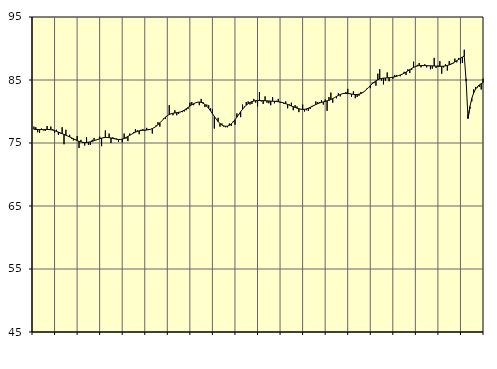
| Category | Samtliga sysselsatta (inkl. sysselsatta utomlands) | Series 1 |
|---|---|---|
| nan | 77.6 | 77.18 |
| 1.0 | 77.5 | 77.15 |
| 1.0 | 76.7 | 77.15 |
| 1.0 | 76.6 | 77.14 |
| 1.0 | 77.3 | 77.13 |
| 1.0 | 77 | 77.13 |
| 1.0 | 76.9 | 77.15 |
| 1.0 | 77.7 | 77.15 |
| 1.0 | 77.2 | 77.14 |
| 1.0 | 77.6 | 77.11 |
| 1.0 | 77.2 | 77.05 |
| 1.0 | 76.6 | 76.97 |
| nan | 77.1 | 76.86 |
| 2.0 | 76.3 | 76.73 |
| 2.0 | 76.5 | 76.61 |
| 2.0 | 77.5 | 76.48 |
| 2.0 | 74.8 | 76.36 |
| 2.0 | 77.1 | 76.23 |
| 2.0 | 76.1 | 76.1 |
| 2.0 | 76.3 | 75.97 |
| 2.0 | 75.7 | 75.82 |
| 2.0 | 75.4 | 75.67 |
| 2.0 | 75.6 | 75.52 |
| 2.0 | 76.1 | 75.38 |
| nan | 74.2 | 75.26 |
| 3.0 | 75.5 | 75.16 |
| 3.0 | 75 | 75.11 |
| 3.0 | 74.6 | 75.08 |
| 3.0 | 75.9 | 75.09 |
| 3.0 | 74.7 | 75.12 |
| 3.0 | 74.7 | 75.18 |
| 3.0 | 75.5 | 75.26 |
| 3.0 | 75.8 | 75.36 |
| 3.0 | 75.5 | 75.47 |
| 3.0 | 75.5 | 75.58 |
| 3.0 | 76 | 75.68 |
| nan | 74.5 | 75.77 |
| 4.0 | 75.9 | 75.84 |
| 4.0 | 77 | 75.88 |
| 4.0 | 75.8 | 75.88 |
| 4.0 | 76.5 | 75.85 |
| 4.0 | 75 | 75.8 |
| 4.0 | 75.9 | 75.73 |
| 4.0 | 75.8 | 75.66 |
| 4.0 | 75.7 | 75.6 |
| 4.0 | 75.2 | 75.56 |
| 4.0 | 75.5 | 75.56 |
| 4.0 | 75.1 | 75.62 |
| nan | 76.5 | 75.72 |
| 5.0 | 75.7 | 75.87 |
| 5.0 | 75.3 | 76.04 |
| 5.0 | 76.5 | 76.22 |
| 5.0 | 76.4 | 76.4 |
| 5.0 | 76.7 | 76.57 |
| 5.0 | 77.2 | 76.72 |
| 5.0 | 77 | 76.84 |
| 5.0 | 76.4 | 76.93 |
| 5.0 | 77.1 | 76.98 |
| 5.0 | 77.2 | 77.02 |
| 5.0 | 76.9 | 77.04 |
| nan | 77.4 | 77.07 |
| 6.0 | 77.2 | 77.11 |
| 6.0 | 77.2 | 77.18 |
| 6.0 | 76.5 | 77.29 |
| 6.0 | 77.5 | 77.44 |
| 6.0 | 77.8 | 77.65 |
| 6.0 | 78.3 | 77.91 |
| 6.0 | 77.6 | 78.2 |
| 6.0 | 78.5 | 78.5 |
| 6.0 | 78.9 | 78.81 |
| 6.0 | 78.8 | 79.1 |
| 6.0 | 79.3 | 79.34 |
| nan | 81 | 79.52 |
| 7.0 | 79.6 | 79.64 |
| 7.0 | 79.4 | 79.72 |
| 7.0 | 80.2 | 79.77 |
| 7.0 | 79.4 | 79.81 |
| 7.0 | 79.6 | 79.86 |
| 7.0 | 79.9 | 79.94 |
| 7.0 | 79.9 | 80.06 |
| 7.0 | 80 | 80.22 |
| 7.0 | 80.2 | 80.41 |
| 7.0 | 80.4 | 80.63 |
| 7.0 | 81.4 | 80.86 |
| nan | 81.5 | 81.06 |
| 8.0 | 81 | 81.24 |
| 8.0 | 81.4 | 81.38 |
| 8.0 | 81.5 | 81.47 |
| 8.0 | 81 | 81.5 |
| 8.0 | 82 | 81.45 |
| 8.0 | 81.5 | 81.32 |
| 8.0 | 80.7 | 81.11 |
| 8.0 | 81.1 | 80.83 |
| 8.0 | 81 | 80.49 |
| 8.0 | 80.5 | 80.09 |
| 8.0 | 80.4 | 79.66 |
| nan | 77.3 | 79.22 |
| 9.0 | 78.8 | 78.79 |
| 9.0 | 79 | 78.41 |
| 9.0 | 77.6 | 78.09 |
| 9.0 | 78.1 | 77.85 |
| 9.0 | 77.6 | 77.71 |
| 9.0 | 77.5 | 77.65 |
| 9.0 | 77.5 | 77.68 |
| 9.0 | 78.1 | 77.81 |
| 9.0 | 77.7 | 78.03 |
| 9.0 | 78.4 | 78.33 |
| 9.0 | 77.9 | 78.69 |
| nan | 79.7 | 79.1 |
| 10.0 | 79.6 | 79.53 |
| 10.0 | 79.1 | 79.96 |
| 10.0 | 81.1 | 80.35 |
| 10.0 | 80.8 | 80.71 |
| 10.0 | 81.5 | 81 |
| 10.0 | 81.6 | 81.24 |
| 10.0 | 81.1 | 81.43 |
| 10.0 | 81.2 | 81.57 |
| 10.0 | 82 | 81.66 |
| 10.0 | 81.4 | 81.72 |
| 10.0 | 80.8 | 81.74 |
| nan | 83.1 | 81.74 |
| 11.0 | 81.6 | 81.73 |
| 11.0 | 81.2 | 81.72 |
| 11.0 | 82.4 | 81.71 |
| 11.0 | 81.4 | 81.69 |
| 11.0 | 81.3 | 81.67 |
| 11.0 | 81 | 81.65 |
| 11.0 | 82.3 | 81.63 |
| 11.0 | 81.3 | 81.61 |
| 11.0 | 81.7 | 81.59 |
| 11.0 | 82 | 81.55 |
| 11.0 | 81.4 | 81.51 |
| nan | 81.5 | 81.44 |
| 12.0 | 81.2 | 81.35 |
| 12.0 | 81.6 | 81.24 |
| 12.0 | 80.5 | 81.12 |
| 12.0 | 81.1 | 81 |
| 12.0 | 81.4 | 80.87 |
| 12.0 | 80.2 | 80.76 |
| 12.0 | 81 | 80.64 |
| 12.0 | 80.8 | 80.53 |
| 12.0 | 79.9 | 80.44 |
| 12.0 | 80.4 | 80.37 |
| 12.0 | 81.1 | 80.33 |
| nan | 80 | 80.34 |
| 13.0 | 80.2 | 80.41 |
| 13.0 | 80.1 | 80.52 |
| 13.0 | 80.4 | 80.65 |
| 13.0 | 80.9 | 80.8 |
| 13.0 | 81 | 80.96 |
| 13.0 | 81.6 | 81.11 |
| 13.0 | 81.5 | 81.24 |
| 13.0 | 81.5 | 81.35 |
| 13.0 | 81.8 | 81.45 |
| 13.0 | 81.1 | 81.53 |
| 13.0 | 81.9 | 81.61 |
| nan | 80.1 | 81.69 |
| 14.0 | 82.3 | 81.78 |
| 14.0 | 83 | 81.9 |
| 14.0 | 81.4 | 82.05 |
| 14.0 | 82.2 | 82.21 |
| 14.0 | 82.1 | 82.39 |
| 14.0 | 82.9 | 82.56 |
| 14.0 | 82.4 | 82.7 |
| 14.0 | 82.8 | 82.81 |
| 14.0 | 82.9 | 82.87 |
| 14.0 | 83.1 | 82.88 |
| 14.0 | 83.6 | 82.87 |
| nan | 82.9 | 82.82 |
| 15.0 | 82.3 | 82.77 |
| 15.0 | 83.2 | 82.72 |
| 15.0 | 82.1 | 82.69 |
| 15.0 | 82.3 | 82.7 |
| 15.0 | 82.5 | 82.75 |
| 15.0 | 83.1 | 82.85 |
| 15.0 | 83.1 | 83.01 |
| 15.0 | 83.2 | 83.24 |
| 15.0 | 83.6 | 83.51 |
| 15.0 | 83.8 | 83.81 |
| 15.0 | 83.7 | 84.11 |
| nan | 84.6 | 84.4 |
| 16.0 | 84.5 | 84.65 |
| 16.0 | 84.1 | 84.87 |
| 16.0 | 86 | 85.04 |
| 16.0 | 86.7 | 85.16 |
| 16.0 | 84.9 | 85.25 |
| 16.0 | 84.3 | 85.3 |
| 16.0 | 84.9 | 85.32 |
| 16.0 | 86.2 | 85.34 |
| 16.0 | 84.8 | 85.36 |
| 16.0 | 85.4 | 85.39 |
| 16.0 | 85.2 | 85.44 |
| nan | 85.8 | 85.5 |
| 17.0 | 85.8 | 85.59 |
| 17.0 | 85.7 | 85.69 |
| 17.0 | 85.6 | 85.8 |
| 17.0 | 85.9 | 85.93 |
| 17.0 | 86.3 | 86.08 |
| 17.0 | 85.8 | 86.25 |
| 17.0 | 86.7 | 86.44 |
| 17.0 | 86.1 | 86.64 |
| 17.0 | 86.6 | 86.83 |
| 17.0 | 87.9 | 87 |
| 17.0 | 87.1 | 87.14 |
| nan | 87.4 | 87.23 |
| 18.0 | 87.7 | 87.28 |
| 18.0 | 87 | 87.3 |
| 18.0 | 87.2 | 87.3 |
| 18.0 | 87.5 | 87.29 |
| 18.0 | 87 | 87.28 |
| 18.0 | 87.3 | 87.26 |
| 18.0 | 86.7 | 87.25 |
| 18.0 | 86.8 | 87.24 |
| 18.0 | 88.5 | 87.22 |
| 18.0 | 86.9 | 87.2 |
| 18.0 | 87.3 | 87.18 |
| nan | 88 | 87.17 |
| 19.0 | 86 | 87.17 |
| 19.0 | 87 | 87.2 |
| 19.0 | 87.5 | 87.24 |
| 19.0 | 86.5 | 87.31 |
| 19.0 | 88 | 87.4 |
| 19.0 | 87.6 | 87.52 |
| 19.0 | 87.6 | 87.68 |
| 19.0 | 88.4 | 87.86 |
| 19.0 | 87.8 | 88.06 |
| 19.0 | 88.5 | 88.25 |
| 19.0 | 87.6 | 88.45 |
| nan | 87.7 | 88.64 |
| 20.0 | 89.8 | 88.8 |
| 20.0 | 85.2 | 84.8 |
| 20.0 | 79.5 | 78.9 |
| 20.0 | 80.4 | 80.77 |
| 20.0 | 81.6 | 82.07 |
| 20.0 | 83.5 | 82.95 |
| 20.0 | 83.9 | 83.54 |
| 20.0 | 83.8 | 83.94 |
| 20.0 | 83.9 | 84.22 |
| 20.0 | 83.5 | 84.42 |
| 20.0 | 85.2 | 84.59 |